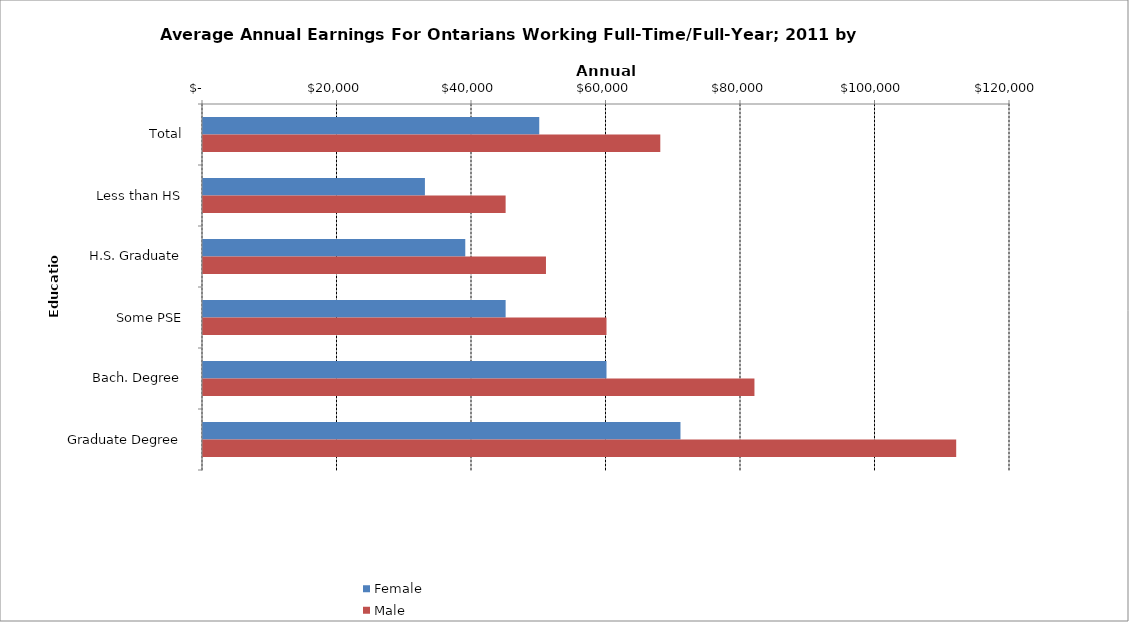
| Category | Female | Male |
|---|---|---|
| Total | 50000 | 68000 |
|  Less than HS  | 33000 | 45000 |
|  H.S. Graduate  | 39000 | 51000 |
|  Some PSE  | 45000 | 60000 |
|  Bach. Degree  | 60000 | 82000 |
|  Graduate Degree  | 71000 | 112000 |